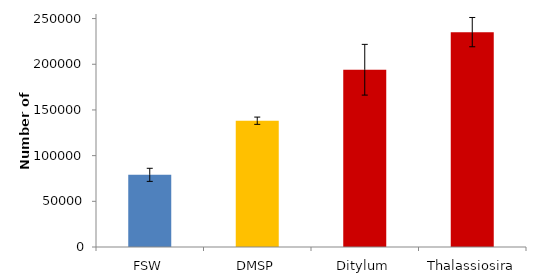
| Category | Series 0 |
|---|---|
| FSW | 78975.799 |
| DMSP | 138204.237 |
| Ditylum | 194003.905 |
| Thalassiosira | 235160.605 |